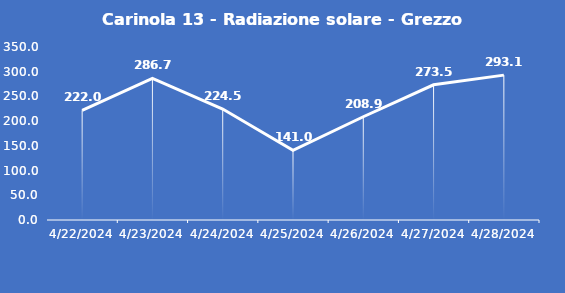
| Category | Carinola 13 - Radiazione solare - Grezzo (W/m2) |
|---|---|
| 4/22/24 | 222 |
| 4/23/24 | 286.7 |
| 4/24/24 | 224.5 |
| 4/25/24 | 141 |
| 4/26/24 | 208.9 |
| 4/27/24 | 273.5 |
| 4/28/24 | 293.1 |